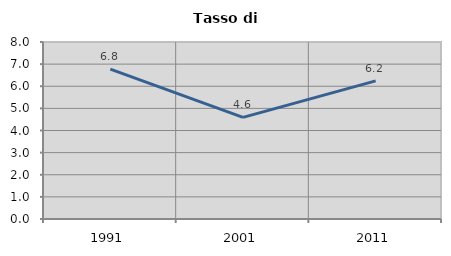
| Category | Tasso di disoccupazione   |
|---|---|
| 1991.0 | 6.778 |
| 2001.0 | 4.595 |
| 2011.0 | 6.244 |